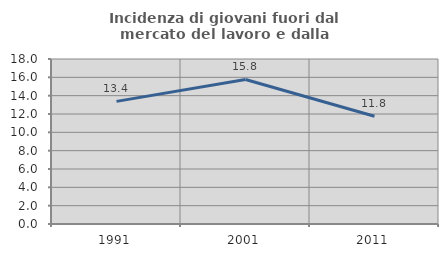
| Category | Incidenza di giovani fuori dal mercato del lavoro e dalla formazione  |
|---|---|
| 1991.0 | 13.377 |
| 2001.0 | 15.768 |
| 2011.0 | 11.751 |